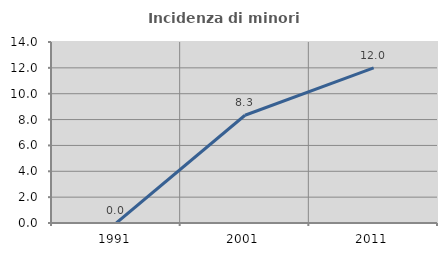
| Category | Incidenza di minori stranieri |
|---|---|
| 1991.0 | 0 |
| 2001.0 | 8.333 |
| 2011.0 | 12 |